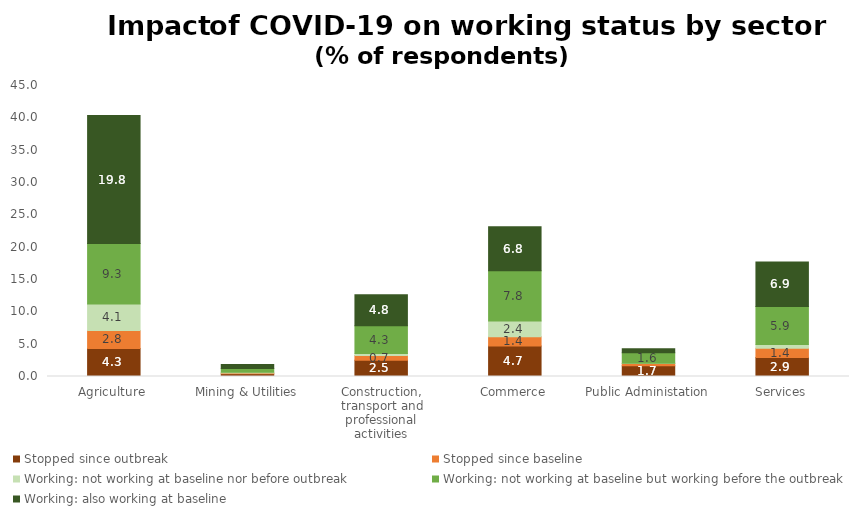
| Category | Stopped since outbreak | Stopped since baseline | Working: not working at baseline nor before outbreak | Working: not working at baseline but working before the outbreak | Working: also working at baseline |
|---|---|---|---|---|---|
| Agriculture | 4.346 | 2.764 | 4.118 | 9.328 | 19.797 |
| Mining & Utilities | 0.425 | 0.119 | 0.126 | 0.572 | 0.597 |
| Construction, transport and professional activities | 2.518 | 0.718 | 0.329 | 4.267 | 4.81 |
| Commerce | 4.734 | 1.411 | 2.441 | 7.767 | 6.796 |
| Public Administation | 1.661 | 0.356 | 0.048 | 1.621 | 0.611 |
| Services | 2.949 | 1.414 | 0.574 | 5.879 | 6.903 |